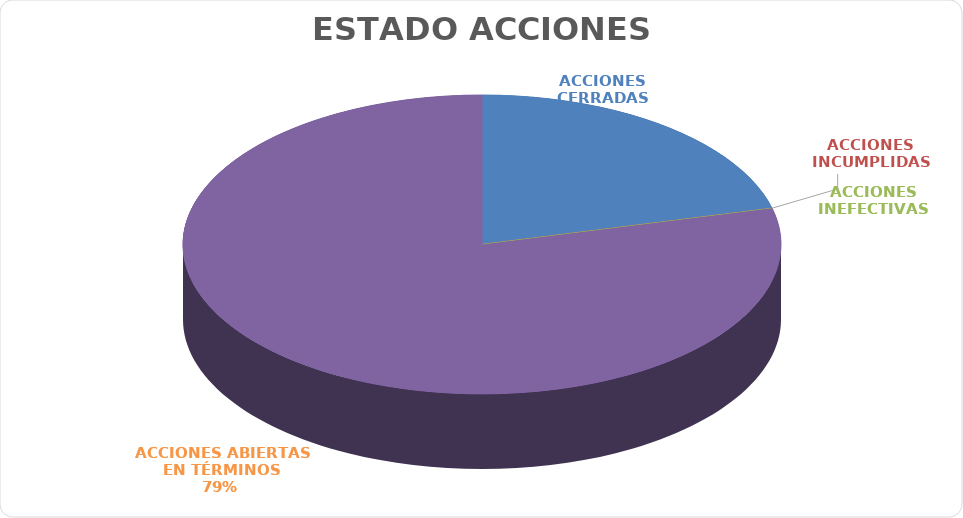
| Category | Series 0 |
|---|---|
| ACCIONES CERRADAS | 23 |
| ACCIONES INCUMPLIDAS | 0 |
| ACCIONES INEFECTIVAS | 0 |
| ACCIONES ABIERTAS EN TÉRMINOS | 86 |